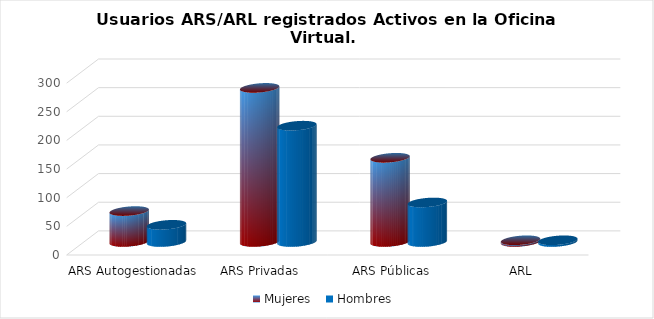
| Category | Mujeres | Hombres |
|---|---|---|
| ARS Autogestionadas | 54 | 30 |
| ARS Privadas | 269 | 203 |
| ARS Públicas | 147 | 69 |
| ARL | 3 | 3 |